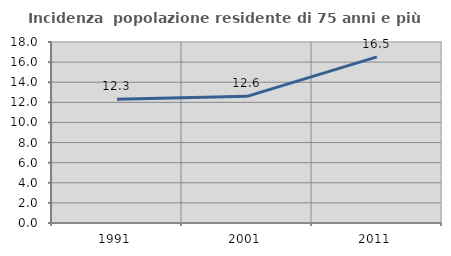
| Category | Incidenza  popolazione residente di 75 anni e più |
|---|---|
| 1991.0 | 12.304 |
| 2001.0 | 12.597 |
| 2011.0 | 16.525 |